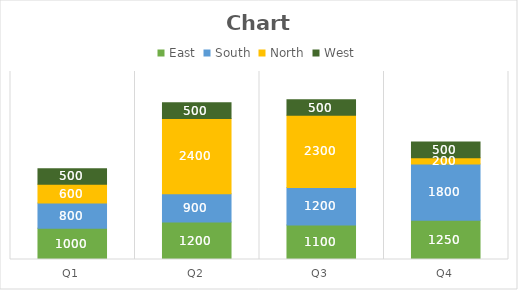
| Category | East | South | North | West |
|---|---|---|---|---|
| Q1 | 1000 | 800 | 600 | 500 |
| Q2 | 1200 | 900 | 2400 | 500 |
| Q3 | 1100 | 1200 | 2300 | 500 |
| Q4 | 1250 | 1800 | 200 | 500 |